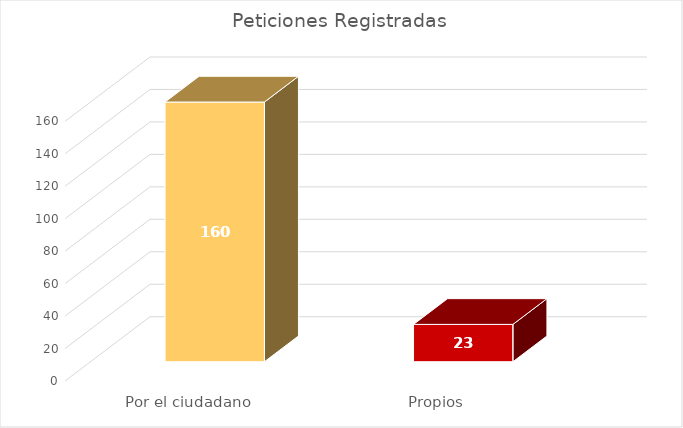
| Category | Total |
|---|---|
| Por el ciudadano | 160 |
| Propios | 23 |